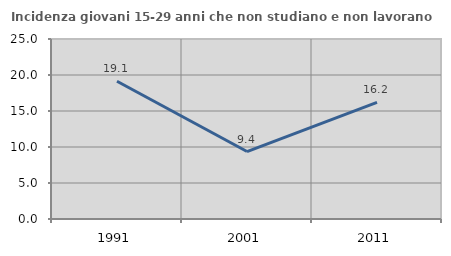
| Category | Incidenza giovani 15-29 anni che non studiano e non lavorano  |
|---|---|
| 1991.0 | 19.134 |
| 2001.0 | 9.368 |
| 2011.0 | 16.203 |